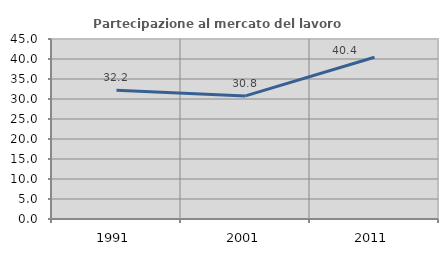
| Category | Partecipazione al mercato del lavoro  femminile |
|---|---|
| 1991.0 | 32.199 |
| 2001.0 | 30.781 |
| 2011.0 | 40.442 |